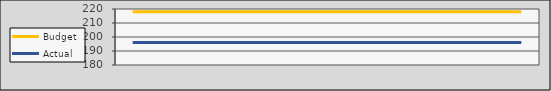
| Category | Budget | Actual |
|---|---|---|
| 2020-07-01 | 218 | 196 |
| 2020-08-01 | 218 | 196 |
| 2020-09-01 | 218 | 196 |
| 2020-10-02 | 218 | 196 |
| 2020-11-02 | 218 | 196 |
| 2020-12-03 | 218 | 196 |
| 2021-01-03 | 218 | 196 |
| 2021-02-03 | 218 | 196 |
| 2021-03-06 | 218 | 196 |
| 2021-04-06 | 218 | 196 |
| 2021-05-07 | 218 | 196 |
| 2021-06-07 | 218 | 196 |